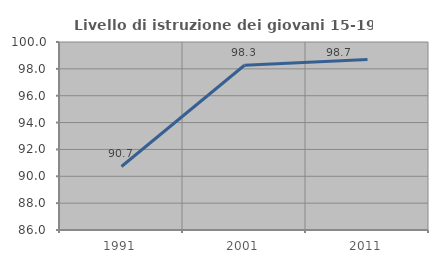
| Category | Livello di istruzione dei giovani 15-19 anni |
|---|---|
| 1991.0 | 90.73 |
| 2001.0 | 98.268 |
| 2011.0 | 98.695 |